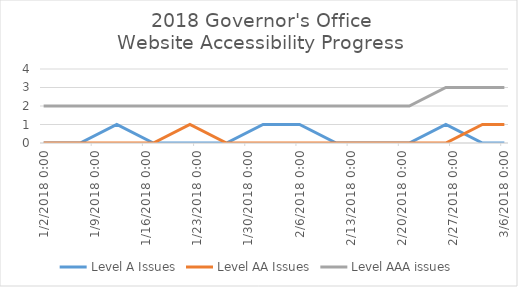
| Category | Level A Issues | Level AA Issues | Level AAA issues |
|---|---|---|---|
| 1/2/18 | 0 | 0 | 2 |
| 1/7/18 | 0 | 0 | 2 |
| 1/12/18 | 1 | 0 | 2 |
| 1/17/18 | 0 | 0 | 2 |
| 1/22/18 | 0 | 1 | 2 |
| 1/27/18 | 0 | 0 | 2 |
| 2/1/18 | 1 | 0 | 2 |
| 2/6/18 | 1 | 0 | 2 |
| 2/11/18 | 0 | 0 | 2 |
| 2/16/18 | 0 | 0 | 2 |
| 2/21/18 | 0 | 0 | 2 |
| 2/26/18 | 1 | 0 | 3 |
| 3/3/18 | 0 | 1 | 3 |
| 3/6/18 | 0 | 1 | 3 |